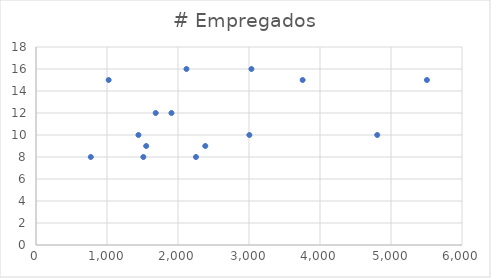
| Category | # Empregados |
|---|---|
| 1512.0 | 8 |
| 3005.0 | 10 |
| 1686.0 | 12 |
| 1908.0 | 12 |
| 2384.0 | 9 |
| 4806.0 | 10 |
| 2253.0 | 8 |
| 1443.0 | 10 |
| 3755.0 | 15 |
| 1023.0 | 15 |
| 1552.0 | 9 |
| 2119.0 | 16 |
| 5506.0 | 15 |
| 3034.0 | 16 |
| 772.0 | 8 |